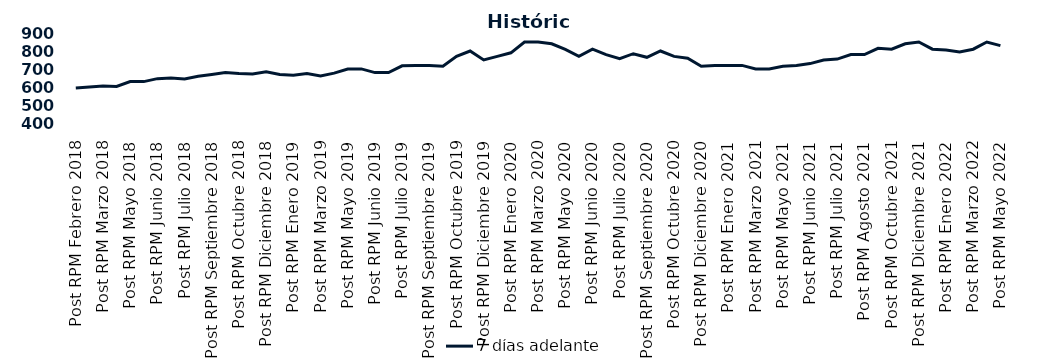
| Category | 7 días adelante  |
|---|---|
| Post RPM Febrero 2018 | 595 |
| Pre RPM Marzo 2018 | 600 |
| Post RPM Marzo 2018 | 605 |
| Pre RPM Mayo 2018 | 603 |
| Post RPM Mayo 2018 | 630 |
| Pre RPM Junio 2018 | 630 |
| Post RPM Junio 2018 | 646.5 |
| Pre RPM Julio 2018 | 650 |
| Post RPM Julio 2018 | 645 |
| Pre RPM Septiembre 2018 | 660 |
| Post RPM Septiembre 2018 | 670 |
| Pre RPM Octubre 2018 | 680 |
| Post RPM Octubre 2018 | 675 |
| Pre RPM Diciembre 2018 | 672.5 |
| Post RPM Diciembre 2018 | 685 |
| Pre RPM Enero 2019 | 670 |
| Post RPM Enero 2019 | 665 |
| Pre RPM Marzo 2019 | 675 |
| Post RPM Marzo 2019 | 661 |
| Pre RPM Mayo 2019 | 677 |
| Post RPM Mayo 2019 | 700 |
| Pre RPM Junio 2019 | 700.5 |
| Post RPM Junio 2019 | 680 |
| Pre RPM Julio 2019 | 680 |
| Post RPM Julio 2019 | 717.5 |
| Pre RPM Septiembre 2019 | 720 |
| Post RPM Septiembre 2019 | 720 |
| Pre RPM Octubre 2019 | 715 |
| Post RPM Octubre 2019 | 770 |
| Pre RPM Diciembre 2019 | 800 |
| Post RPM Diciembre 2019 | 750 |
| Pre RPM Enero 2020 | 770 |
| Post RPM Enero 2020 | 790 |
| Pre RPM Marzo 2020 | 850 |
| Post RPM Marzo 2020 | 850 |
| Pre RPM Mayo 2020 | 840 |
| Post RPM Mayo 2020 | 808.5 |
| Pre RPM Junio 2020 | 770 |
| Post RPM Junio 2020 | 810 |
| Pre RPM Julio 2020 | 780 |
| Post RPM Julio 2020 | 757 |
| Pre RPM Septiembre 2020 | 785 |
| Post RPM Septiembre 2020 | 765 |
| Pre RPM Octubre 2020 | 800 |
| Post RPM Octubre 2020 | 770 |
| Pre RPM Diciembre 2020 | 760 |
| Post RPM Diciembre 2020 | 715 |
| Pre RPM Enero 2021 | 720 |
| Post RPM Enero 2021 | 720 |
| Pre RPM Marzo 2021 | 720 |
| Post RPM Marzo 2021 | 700 |
| Pre RPM Mayo 2021 | 700 |
| Post RPM Mayo 2021 | 715 |
| Pre RPM Junio 2021 | 720 |
| Post RPM Junio 2021 | 730 |
| Pre RPM Julio 2021 | 750 |
| Post RPM Julio 2021 | 755 |
| Pre RPM Agosto 2021 | 780 |
| Post RPM Agosto 2021 | 780 |
| Pre RPM Octubre 2021 | 815 |
| Post RPM Octubre 2021 | 810 |
| Pre RPM Diciembre 2021 | 840 |
| Post RPM Diciembre 2021 | 850 |
| Pre RPM Enero 2022 | 810 |
| Post RPM Enero 2022 | 805 |
| Pre RPM Marzo 2022 | 795 |
| Post RPM Marzo 2022 | 810 |
| Pre RPM Mayo 2022 | 850 |
| Post RPM Mayo 2022 | 830 |